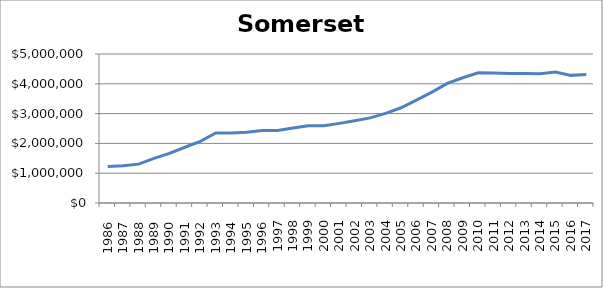
| Category | Somerset (000s) |
|---|---|
|       1986 | 1224750 |
|       1987 | 1247400 |
|       1988 | 1304750 |
|       1989 | 1498300 |
|       1990 | 1665300 |
|       1991 | 1870600 |
|       1992 | 2069100 |
|       1993 | 2352750 |
|       1994 | 2351450 |
|       1995 | 2370900 |
|       1996 | 2433600 |
| 1997 | 2432300 |
| 1998 | 2518850 |
| 1999 | 2589900 |
| 2000 | 2592650 |
| 2001 | 2671600 |
| 2002 | 2762950 |
| 2003 | 2856500 |
| 2004 | 3007600 |
| 2005 | 3195150 |
| 2006 | 3454800 |
| 2007 | 3719900 |
| 2008 | 4011300 |
| 2009 | 4202550 |
| 2010 | 4370350 |
| 2011 | 4358800 |
| 2012 | 4347150 |
| 2013 | 4347000 |
| 2014 | 4340800 |
| 2015 | 4398500 |
| 2016 | 4282950 |
| 2017 | 4313850 |